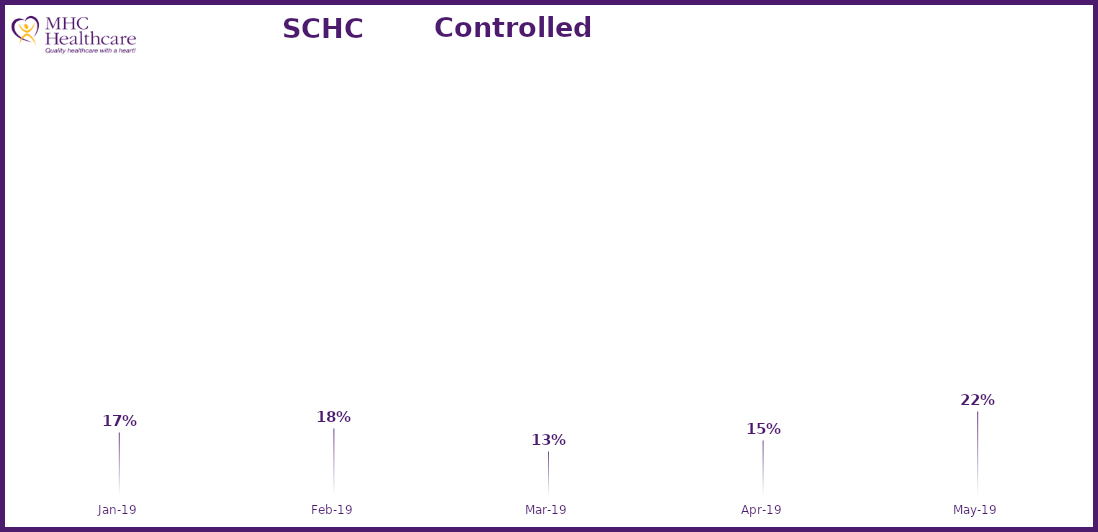
| Category | Online Access to Health Information |
|---|---|
| 2019-01-01 | 0.168 |
| 2019-02-01 | 0.179 |
| 2019-03-01 | 0.127 |
| 2019-04-01 | 0.151 |
| 2019-05-01 | 0.217 |